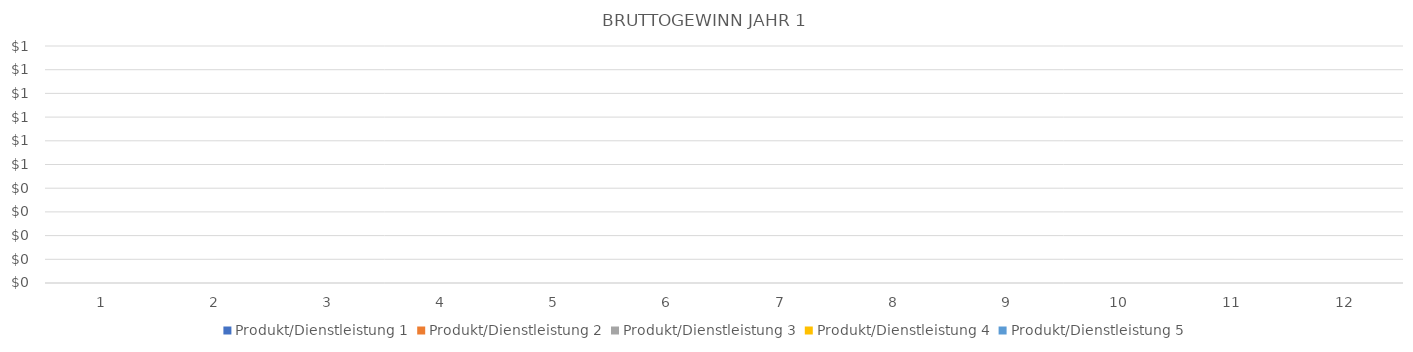
| Category | Produkt/Dienstleistung 1 | Produkt/Dienstleistung 2 | Produkt/Dienstleistung 3 | Produkt/Dienstleistung 4 | Produkt/Dienstleistung 5 |
|---|---|---|---|---|---|
| 0 | 0 | 0 | 0 | 0 | 0 |
| 1 | 0 | 0 | 0 | 0 | 0 |
| 2 | 0 | 0 | 0 | 0 | 0 |
| 3 | 0 | 0 | 0 | 0 | 0 |
| 4 | 0 | 0 | 0 | 0 | 0 |
| 5 | 0 | 0 | 0 | 0 | 0 |
| 6 | 0 | 0 | 0 | 0 | 0 |
| 7 | 0 | 0 | 0 | 0 | 0 |
| 8 | 0 | 0 | 0 | 0 | 0 |
| 9 | 0 | 0 | 0 | 0 | 0 |
| 10 | 0 | 0 | 0 | 0 | 0 |
| 11 | 0 | 0 | 0 | 0 | 0 |